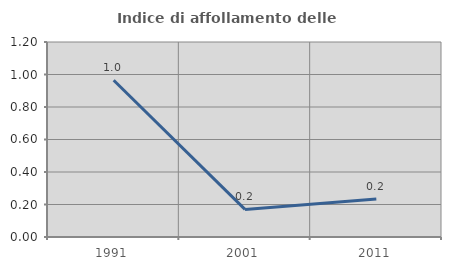
| Category | Indice di affollamento delle abitazioni  |
|---|---|
| 1991.0 | 0.965 |
| 2001.0 | 0.17 |
| 2011.0 | 0.234 |